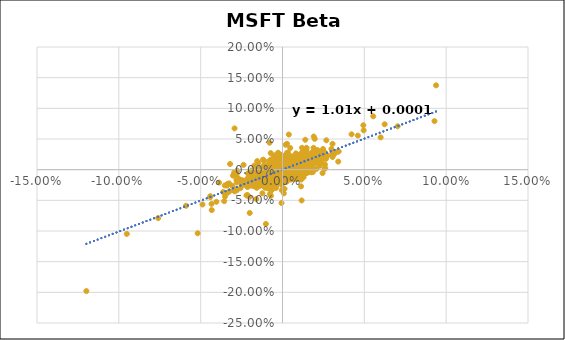
| Category | Series 0 |
|---|---|
| 0.0022232803457622463 | -0.002 |
| -0.016643094431470606 | -0.019 |
| -0.018151208036480848 | -0.026 |
| 0.00304327583661701 | 0.001 |
| -0.006554890129173208 | -0.003 |
| 0.015532409517731827 | 0.006 |
| 0.003261703042884756 | 0.02 |
| 0.02297393528374414 | 0.024 |
| -0.0021831116812874862 | -0.01 |
| 0.008170794068229847 | 0.027 |
| 0.010941355061463431 | 0.008 |
| -0.03236488351007216 | -0.035 |
| -0.0015221883958135285 | 0.004 |
| -0.02332016543333515 | -0.018 |
| 0.001762194844060927 | -0.006 |
| -0.00035636837875119287 | 0.003 |
| 0.005419488922094429 | 0.012 |
| -0.00019991927787654795 | -0.002 |
| -0.019086676677205427 | -0.009 |
| -0.020773476413007863 | -0.025 |
| 8.641209140813899e-05 | 0.012 |
| -0.015395733182517968 | -0.015 |
| -0.015772090500047797 | -0.02 |
| -0.020588306814405377 | -0.022 |
| -0.02711224768478282 | -0.015 |
| 0.049593807154098 | 0.064 |
| 0.008562629168861635 | 0.012 |
| -0.0012415472330372657 | -0.001 |
| 0.008492440882795549 | 0.009 |
| 0.0012685242435728217 | 0.003 |
| -0.02475667621502542 | -0.022 |
| 0.0343356931888279 | 0.03 |
| 0.00701043468644591 | 0.02 |
| 0.009695296290921585 | 0.005 |
| 0.0040980263439003295 | 0.01 |
| 0.004518445159692908 | -0.004 |
| -0.00014634296629478794 | 0.002 |
| -0.005257562801876614 | -0.003 |
| 0.010721711756711327 | -0.013 |
| 0.002221966823736654 | 0.003 |
| 0.007591452926111408 | -0.012 |
| 0.013183052853609212 | 0.027 |
| -0.014157284018107563 | -0.014 |
| 0.0022028941471379238 | -0.001 |
| 0.001375677416909804 | 0.002 |
| 0.0084887201825663 | 0.018 |
| -0.0078468605052614 | -0.003 |
| -0.001456209694195909 | -0.001 |
| 0.015549242424242493 | 0.014 |
| 0.008597377892989533 | 0.007 |
| 0.000898635405495396 | 0.005 |
| 0.006776204217207926 | 0.011 |
| 0.004708481505539597 | 0 |
| -0.002224495014062744 | -0.009 |
| -0.009357119061652264 | -0.004 |
| 0.0006762624489569102 | 0.003 |
| 0.0007090417596054 | -0.009 |
| 0.012890250202966858 | 0.014 |
| 0.003023976857468691 | 0.016 |
| -0.0026516238471793185 | -0.004 |
| 0.010878709851296353 | 0.025 |
| 0.0014987750396311394 | 0 |
| 0.0017771318387196366 | -0.002 |
| -0.003526412180845262 | 0 |
| 0.006411088047050706 | 0.003 |
| 0.0012317960947767492 | -0.013 |
| -0.0007903837831845228 | -0.009 |
| -0.0005440423780378456 | -0.025 |
| -0.0028255466662847617 | 0.008 |
| 0.0068953381050032014 | 0 |
| -0.0038806002090102654 | -0.007 |
| -0.0011314768996100177 | 0.001 |
| -0.0065241159285216455 | 0.002 |
| -0.008125710368218741 | -0.011 |
| -0.0021317385309919112 | -0.007 |
| 0.014666049353461608 | 0.007 |
| 0.0029533287823806376 | 0.009 |
| 0.006949618845646821 | -0.016 |
| -0.0008680432029370966 | 0.003 |
| 0.004984902865607044 | 0.003 |
| 0.0037059607153993035 | 0.007 |
| -0.0001306063665308388 | 0.004 |
| -0.0029443226469249018 | 0.011 |
| 0.010852515552911779 | 0.021 |
| -0.018974527826038257 | -0.006 |
| -0.0008390729493592541 | 0.005 |
| 0.007182778484540853 | -0.002 |
| -0.004644380264399728 | 0 |
| 0.0035895443381801506 | 0.004 |
| 0.006734293751598397 | 0.01 |
| 0.01156858594411525 | 0.02 |
| 1.7438676892522764e-05 | -0.007 |
| 0.0021484075277968806 | 0.022 |
| 0.0020846384074615365 | 0.009 |
| 0.004636398681665099 | 0.008 |
| 0.0010474498226595852 | 0.007 |
| -0.0060674708281390766 | -0.013 |
| 0.0034778681120144483 | -0.007 |
| 3.808587325715429e-05 | 0.01 |
| 0.006609378462220095 | 0.012 |
| -0.0006294261903205811 | 0.005 |
| 0.000509364739569973 | -0.002 |
| -0.002273774879087531 | 0.01 |
| 0.0015790653174507785 | -0.004 |
| 0.001012037741434657 | -0.004 |
| 0.008841219132246891 | 0.006 |
| -0.0021917864252406494 | 0.003 |
| -0.00036894696387390624 | -0.001 |
| 0.004685305365033532 | -0.014 |
| 0.0010714723049920494 | -0.007 |
| 0.0009514004274504551 | 0.008 |
| -0.007502130129708795 | -0.024 |
| -0.0021239991380873624 | 0.011 |
| 0.00963832295922562 | -0.002 |
| -0.004471014787957861 | -0.005 |
| -0.016511677868827124 | -0.024 |
| -0.0016053813214057522 | 0.002 |
| -0.0030214418181440106 | -0.003 |
| 0.0037203210344445292 | 0 |
| -0.024130630943291487 | -0.022 |
| 0.008016017810211773 | 0.007 |
| 0.00583895766667486 | 0.001 |
| 0.008895249319527565 | 0.003 |
| -0.005837319908772343 | 0.001 |
| -0.006749360908960611 | -0.008 |
| 0.008495790833841 | 0.003 |
| -0.002824365652362215 | -0.013 |
| -0.011914139769699683 | 0.016 |
| 0.001353534780883292 | 0.008 |
| -0.008375618352052028 | -0.011 |
| -0.0069119572935958384 | -0.008 |
| 0.0020984398243635294 | 0.006 |
| -0.013195355808466647 | -0.006 |
| -0.0027652013400870645 | -0.001 |
| 0.021432345278653342 | 0.03 |
| 0.008161896642135735 | 0.007 |
| 0.006135555437609463 | 0.002 |
| 0.010497663083042452 | 0.001 |
| 0.0046600819951694294 | 0.004 |
| -0.00034987685027698667 | 0 |
| -0.002037619727485618 | 0.005 |
| 0.004097449858325275 | 0.017 |
| -0.0016115422390061696 | 0.017 |
| 0.0009317695307899942 | 0.006 |
| 0.009717372571954597 | 0.002 |
| 0.002985176934281464 | 0.002 |
| 0.009472195075278522 | 0.016 |
| -0.0012592326804730103 | -0.009 |
| -0.001731933325650914 | -0.019 |
| -0.009496324715228988 | -0.004 |
| -0.0012339839170762978 | 0.008 |
| 0.003823212459416858 | 0.003 |
| 0.005757422425228809 | 0.005 |
| 0.007672277820080398 | 0.011 |
| 0.0029281490252435205 | -0.001 |
| 0.007672358989710748 | 0.009 |
| -0.0018058494836139527 | -0.003 |
| -0.004835457345313876 | 0.007 |
| 0.0012365799156572876 | -0.004 |
| 0.004510627158405667 | -0.006 |
| 0.002285278994477169 | 0.016 |
| 0.004620138604158219 | 0.02 |
| 0.00017585947169163063 | 0.002 |
| -0.0034037753375577573 | -0.007 |
| -0.006531204644412147 | -0.008 |
| 0.0035819355184592006 | -0.005 |
| -0.0061767347442999165 | -0.007 |
| 0.0028287212634507952 | -0.008 |
| 0.006847502370160408 | 0.009 |
| 0.00468811866363672 | 0.008 |
| -0.00526235610486292 | 0.004 |
| 0.007387629133693174 | 0.006 |
| -0.00161606948107329 | 0.005 |
| -0.002578641959370631 | -0.003 |
| -0.010885509660889747 | -0.017 |
| -0.008998852495319398 | -0.004 |
| -0.0072827367651240316 | -0.003 |
| -0.02977780051499812 | -0.034 |
| 0.013017006826634425 | 0.019 |
| 0.0007668897934256513 | -0.004 |
| 0.01876226603513209 | 0.018 |
| -0.006616543400644659 | -0.007 |
| -0.0123173384955374 | -0.014 |
| 0.015131647413882954 | 0.006 |
| -0.02929276360753441 | -0.032 |
| 0.002464268112370549 | 0.001 |
| 0.014426183452732166 | 0.009 |
| 0.012105875347909967 | 0.021 |
| -0.007914764079147596 | 0.044 |
| 0.008246825558263726 | 0.015 |
| -0.0005060815269983809 | 0.003 |
| -0.025946389777450785 | -0.016 |
| 0.010983067039910699 | 0.005 |
| -0.0032031906836484936 | -0.002 |
| 0.006545469754213773 | 0.017 |
| 0.012687244194824032 | 0.024 |
| 0.0006428273461489553 | 0.003 |
| -0.006899120439028739 | -0.017 |
| 0.010842075925499017 | 0 |
| 0.013009823744460025 | 0.018 |
| 0.0009106182795699524 | 0.013 |
| -9.400042300200528e-05 | 0.008 |
| 0.00032231746255573235 | 0.001 |
| 0.0072296678179091245 | -0.001 |
| 0.0028791074766822966 | 0.005 |
| -0.0007243559711188619 | 0.001 |
| -0.0031356092824674775 | -0.013 |
| 0.002581755593803692 | -0.003 |
| 0.0003426822370828919 | 0.003 |
| 1.9955233758972568e-05 | -0.012 |
| -0.004895586322955614 | -0.015 |
| -9.69228661094057e-05 | 0.007 |
| -0.00841639425358831 | -0.004 |
| 0.006158565361019441 | 0.012 |
| -0.0024289165022262083 | 0.007 |
| -0.005316326462073695 | 0 |
| 0.005047623227845355 | 0.009 |
| -0.012258376613342059 | -0.004 |
| -0.01790323952044892 | -0.024 |
| 0.007971990677411389 | 0.006 |
| 0.014216853396000317 | 0.005 |
| -0.004478304612789308 | -0.005 |
| -0.015560826054260457 | 0 |
| 0.009104546742895181 | 0.01 |
| 0.00641570185654583 | 0.012 |
| 0.010938930544257763 | 0.013 |
| -0.001387079289088211 | -0.002 |
| 0.009955666436289423 | 0.006 |
| -0.0019995460129251796 | 0.001 |
| 0.002762828253096483 | 0.004 |
| -0.003919344885671916 | 0.005 |
| 0.006871609403255041 | -0.005 |
| -0.0035686728395061262 | 0.002 |
| 0.002847139009142241 | -0.011 |
| 0.001920439870594981 | -0.003 |
| 0.004072697314876805 | 0.002 |
| 0.00558137996062924 | 0.01 |
| -0.0008323956544341593 | -0.011 |
| 0.0032533282404039188 | 0.009 |
| -0.0030228734036372717 | -0.007 |
| 0.009662360578885698 | 0.012 |
| 0.00370405391746087 | -0.01 |
| -0.001185730946278274 | -0.012 |
| 0.0007025258405917167 | 0.008 |
| 0.0027301269509030224 | -0.005 |
| 0.002560628553277322 | 0 |
| -0.001962445200253349 | -0.004 |
| 0.001564620781921544 | 0.006 |
| 0.0007115504036430131 | 0.007 |
| 0.0008370932502488326 | 0.007 |
| 0.007695462486638771 | 0.003 |
| 0.0005031309486422941 | 0.007 |
| -0.000592563172038818 | -0.054 |
| -0.0037561935529359936 | -0.022 |
| -0.0015827773238195064 | -0.011 |
| 0.0021749357185665286 | -0.002 |
| 0.007507338543994324 | 0.002 |
| 0.0021955297992111156 | 0.011 |
| 0.00417446792250975 | 0.01 |
| -0.004011250527170329 | -0.011 |
| -0.008631064190157245 | -0.013 |
| -0.006638042050567283 | -0.017 |
| 0.006323548428811776 | 0 |
| 0.001500276282141666 | -0.005 |
| 0.009135730393304842 | 0.006 |
| -0.00316283682622831 | 0.011 |
| -0.0010969527672547441 | -0.003 |
| 0.0029082017034209873 | -0.018 |
| 0.008575166394515055 | 0 |
| 7.258794976916505e-05 | 0.01 |
| 0.007147816208028068 | 0.007 |
| 0.00033527080167328194 | 0.01 |
| -0.000432260408705365 | 0.001 |
| 0.004459221469443442 | 0.01 |
| 0.0049448269622538454 | 0.004 |
| 0.0008661314657181229 | -0.009 |
| -0.0001954088231737039 | 0.007 |
| 0.005128157399996169 | 0.001 |
| 3.395156038288327e-05 | -0.004 |
| -0.005780828513404224 | -0.012 |
| 0.002946024729223451 | 0.005 |
| 0.008378781594537532 | 0.006 |
| -0.007059870773669763 | -0.003 |
| 0.0035333941295578875 | 0.005 |
| -0.0028032085956850583 | -0.007 |
| 0.0049024150649641385 | 0.015 |
| 0.006655292725288531 | 0.015 |
| -0.0028552233792408233 | -0.004 |
| 0.006976281256220629 | -0.004 |
| -0.0015145386587512855 | -0.002 |
| 0.001870155186330269 | 0.008 |
| 0.00836654718799501 | 0.019 |
| 0.003862144651035182 | 0.014 |
| -0.002651954277064661 | 0.004 |
| 0.0002890878375325645 | 0 |
| 0.0011409648528637462 | 0.003 |
| -0.009042140524546438 | -0.007 |
| -0.015730684849202037 | -0.003 |
| 0.010053551114029613 | 0.012 |
| -0.0008668473616095795 | 0.001 |
| 0.003134355715769477 | -0.005 |
| -0.017705852615678808 | -0.02 |
| 0.0072546442124061805 | 0.015 |
| 0.014980362705145023 | 0.015 |
| 0.011250640619361318 | 0.013 |
| 0.0033256464618900416 | 0.003 |
| -0.005400833288500828 | -0.006 |
| 0.007326359568592178 | 0.014 |
| 0.0016884988171557147 | 0.004 |
| 0.0064626610081155444 | 0 |
| -0.0016304428235363044 | 0.003 |
| 0.0018435419717006685 | 0.011 |
| -0.0029199801192842934 | -0.004 |
| 0.004705826501577137 | -0.001 |
| -0.0038155427255142094 | 0.014 |
| -0.010518108756295885 | -0.007 |
| -0.0335135944873044 | -0.023 |
| -0.030280015747592093 | -0.01 |
| -0.003778518705585654 | -0.009 |
| -0.044163278665378725 | -0.045 |
| -0.008238327357692588 | -0.031 |
| 0.04603922524388837 | 0.056 |
| -0.028107940185681968 | -0.009 |
| 0.042202592421180185 | 0.058 |
| -0.03392202215889484 | -0.026 |
| -0.017053909799797706 | -0.027 |
| -0.07596968075979771 | -0.079 |
| 0.04939633578003022 | 0.072 |
| -0.048868410917935035 | -0.057 |
| -0.09511268047479748 | -0.105 |
| 0.0928711945304439 | 0.079 |
| -0.11984050283657066 | -0.198 |
| 0.05995482224354909 | 0.053 |
| -0.05183082330706679 | -0.104 |
| 0.004707893749218206 | 0.035 |
| -0.043359522534749395 | -0.056 |
| -0.02929385835517062 | 0.067 |
| 0.09382765710199337 | 0.138 |
| 0.011535019797084933 | -0.016 |
| 0.06241416083633622 | 0.074 |
| -0.0336873163071707 | -0.024 |
| 0.03351603599491648 | 0.029 |
| -0.0160127919593398 | -0.048 |
| -0.04414239782712159 | -0.043 |
| 0.022829386763812964 | 0.015 |
| -0.015137124539950086 | -0.014 |
| 0.07033130412070787 | 0.071 |
| -0.0016030454108602044 | 0.005 |
| 0.03405642604938697 | 0.013 |
| 0.01448737809002254 | 0.034 |
| -0.010104594561656355 | -0.014 |
| 0.030572524197665762 | 0.042 |
| -0.022030456139364496 | -0.042 |
| 0.005816710738100639 | 0.007 |
| 0.026793591827257934 | 0.048 |
| -0.017880997439608137 | -0.016 |
| -0.030674846625766805 | -0.026 |
| 0.02293024819481393 | 0.018 |
| -0.000539418642451106 | -0.009 |
| 0.01391807849024218 | 0.049 |
| 0.014714073196697708 | 0.026 |
| -0.005242350129234907 | -0.001 |
| 0.026583874358714787 | 0.019 |
| -0.009212419757034462 | -0.009 |
| -0.028059043479156554 | -0.006 |
| 0.004249817183674676 | 0.015 |
| 0.009040573531170715 | 0.017 |
| -0.006979403438802989 | -0.007 |
| 0.011504623615899323 | 0.025 |
| 0.016871501011734846 | 0.022 |
| 0.0001331148883882971 | 0.009 |
| -0.020500377108651713 | -0.015 |
| -0.017462684487059787 | -0.012 |
| 0.01152482269503552 | 0.019 |
| 0.003926380368098004 | 0.021 |
| 0.03150120473513285 | 0.025 |
| -0.010484408800538914 | -0.03 |
| 0.01665104312780974 | 0 |
| -0.007773563825670182 | 0.011 |
| 0.002353731206609311 | 0.004 |
| 0.012289160703107926 | 0.002 |
| 0.014827343010993532 | 0.02 |
| -0.0021079466294262605 | -0.009 |
| 0.004812310007822562 | 0.014 |
| 0.0037512605483673855 | -0.005 |
| 0.00821080396500995 | 0.022 |
| 0.013648963587616247 | -0.007 |
| -0.0033686961032639573 | -0.008 |
| 0.02621170498176606 | 0.024 |
| 0.012041591393674889 | 0.007 |
| -0.007799182648133396 | 0 |
| -0.0053130787794885 | -0.009 |
| -0.058944121574601716 | -0.059 |
| 0.013060857399820103 | 0.012 |
| 0.008312207568449193 | -0.004 |
| 0.018962430582503575 | 0.036 |
| -0.0036002995449221364 | 0.004 |
| 0.000594188515139038 | -0.007 |
| -0.005649463621948292 | -0.01 |
| 0.006495057687217143 | 0.01 |
| 0.004307441642665166 | 0.005 |
| -0.025855158736495243 | -0.017 |
| 0.01095946995898811 | -0.003 |
| -0.024226917788673585 | -0.018 |
| 0.01468569814393228 | 0.021 |
| 0.015409859690034278 | 0.018 |
| 0.005022110834792981 | -0.009 |
| 0.004541282342595654 | 0.001 |
| 0.0158817383970018 | 0.004 |
| -0.010818562640735552 | -0.009 |
| 0.007827502448081614 | 0.007 |
| -0.005643639942711776 | -0.005 |
| 0.01046620453355751 | 0.009 |
| -0.009362519779971379 | -0.002 |
| 0.013406355182839835 | 0.033 |
| 0.00908203857989931 | 0 |
| -0.0034061043340275488 | 0.001 |
| 0.00284863958800452 | 0.009 |
| 0.008406905384326757 | -0.001 |
| 0.0016790493997245193 | 0.009 |
| 0.005747091149111094 | 0.01 |
| -0.012319827107282633 | -0.005 |
| -0.0061903908321639944 | 0.006 |
| 0.007395129414764723 | 0.008 |
| -0.006473401020556158 | -0.008 |
| 0.012428381451883519 | -0.002 |
| -0.0037502608610255894 | 0.006 |
| 0.007670459796317086 | -0.003 |
| 0.007181026681992719 | 0.003 |
| 0.0036119601409574376 | 0.006 |
| 0.0064297401187354275 | -0.001 |
| 0.006427727877827971 | 0.007 |
| 0.0006329945419150107 | 0.008 |
| 0.0027422358024395965 | 0.011 |
| -0.007969123366671882 | 0.001 |
| 0.013996502374245878 | 0.024 |
| -0.0020471252976762555 | 0 |
| -0.00017193183199293305 | -0.004 |
| 0.0027098744385312123 | 0.027 |
| 0.0023033775972136628 | -0.011 |
| -0.004404415625792857 | -0.008 |
| 0.0031586589033587575 | -0.008 |
| 0.0034411358997610275 | 0.009 |
| 0.01004368354743379 | 0.012 |
| 0.003596325569466652 | -0.002 |
| 0.010195666188487662 | 0.02 |
| 0.0016730243508407128 | -0.011 |
| 0.006732576659826961 | -0.008 |
| -0.0021949766391772263 | -0.004 |
| 0.00752504778148233 | 0.003 |
| 0.015365857116526938 | 0.004 |
| -0.03512583639592948 | -0.044 |
| -0.008132999137496877 | -0.018 |
| -0.027756378831384043 | -0.001 |
| 0.020145024971186976 | 0.029 |
| -0.017584790641843373 | -0.016 |
| 0.0005330634075928486 | 0.013 |
| 0.01274180851668838 | 0.016 |
| 0.005219385613883576 | 0.018 |
| -0.004618958014818264 | -0.014 |
| -0.00841237162124231 | -0.006 |
| -0.01118257020384228 | -0.017 |
| -0.011571124305988612 | -0.01 |
| 0.010517942372282096 | 0.004 |
| -0.02372141140135786 | -0.025 |
| 0.002987407782707008 | -0.003 |
| 0.015976763311659203 | 0.011 |
| 0.016110548559024496 | 0.014 |
| -0.004812626805108078 | -0.001 |
| 0.008253709372292528 | 0.021 |
| 0.005292893250074426 | 0 |
| -0.009577614765735931 | 0.006 |
| 0.017972655760030154 | 0.01 |
| -0.01397347884762079 | -0.02 |
| 0.017396763434365692 | 0.023 |
| 0.008010083522448141 | 0.006 |
| 0.008793587151092463 | 0.005 |
| 0.016415789988323715 | 0.003 |
| -0.006306907889152336 | 0.012 |
| -0.006623138843883547 | -0.011 |
| -0.0015278028589691406 | 0.002 |
| 0.00013492797142955482 | 0 |
| -0.016329822808936134 | -0.014 |
| 0.0047272769717412455 | 0.008 |
| -0.002195682985199454 | -0.005 |
| 0.005218945382994278 | -0.012 |
| 0.0034457896215134287 | 0.007 |
| -0.01858953826264864 | -0.025 |
| -0.0030256074002417144 | 0.003 |
| -0.03528790685054317 | -0.026 |
| 0.011947307117329942 | 0 |
| -0.012129506270184387 | -0.011 |
| 0.01231819349472163 | 0.015 |
| 0.017799313644932147 | 0.024 |
| 0.022047038430944355 | 0.019 |
| 0.019460190971818836 | 0.011 |
| -0.00028771240154390476 | -0.006 |
| 0.011699872344305584 | -0.05 |
| -0.001399802844669673 | 0.021 |
| 0.007651888434169196 | 0.008 |
| -0.009978559392721298 | -0.005 |
| 0.013610365817456005 | 0.003 |
| 0.011648048198820149 | 0.009 |
| -0.004791957892531062 | -0.025 |
| -0.01156383241031389 | -0.01 |
| 0.003946420613320845 | 0.004 |
| -0.0067925413261787915 | -0.004 |
| 0.00563591695385024 | 0.006 |
| 0.016161717804443754 | 0.007 |
| -0.0015844155129681736 | 0.002 |
| 0.0023969253233782073 | 0.007 |
| -0.0045954897137437944 | 0.005 |
| 0.011271167954760575 | -0.003 |
| 0.0017911507324332998 | -0.02 |
| -0.0006241465681479097 | -0.011 |
| 0.008836235109307422 | -0.015 |
| -0.0019355954929820562 | -0.005 |
| 0.002787137455443789 | -0.004 |
| -0.007949220068876994 | 0.015 |
| -0.0012851160688518437 | -0.003 |
| -0.001264960061067022 | -0.001 |
| -0.004359266922526861 | 0.004 |
| 0.012921214314501217 | 0.009 |
| 0.0017728480872187813 | 0.006 |
| 0.005757638800703457 | 0.016 |
| -0.0035111001267972286 | -0.013 |
| -0.003906281591951277 | 0.002 |
| -0.0020731166033364223 | -0.004 |
| 0.0007458112528002658 | -0.001 |
| 0.0035365757816374632 | 0.004 |
| 0.008722515973276224 | -0.006 |
| -0.0022273622890431888 | -0.011 |
| 0.0013415471795312772 | -0.003 |
| 0.00643883774021714 | 0.001 |
| -0.01475478359029514 | -0.006 |
| 0.007082539553862066 | 0.008 |
| 0.005709900559720538 | 0.006 |
| 0.01484736429268918 | -0.005 |
| 0.005491890982414871 | 0.011 |
| -0.006554796741165214 | 0.008 |
| 0.0004158321511944507 | 0.019 |
| 0.0022756031663768717 | -0.008 |
| -0.003753438464607517 | -0.021 |
| -0.00719001775768402 | 0.027 |
| 0.008136402839514334 | -0.009 |
| 0.013935576257400273 | 0.004 |
| 0.0003167309215053038 | 0.017 |
| -0.0030105863636010755 | 0.018 |
| 0.003615803325289546 | 0.004 |
| -0.0014888363213811928 | -0.009 |
| -0.025677859113367063 | -0.03 |
| 0.009760662477304782 | 0.015 |
| -0.019311502938707092 | -0.026 |
| 0.01605173602136656 | -0.003 |
| 0.013898236818535858 | 0.008 |
| 0.001008804827627774 | 0.007 |
| 0.01085330416143404 | 0.017 |
| 0.003897472454245321 | 0 |
| 0.007399345996609075 | 0.004 |
| -0.0011134975827398197 | -0.012 |
| -0.0003451599624669788 | 0.007 |
| 0.0016624551137118804 | -0.006 |
| 0.004710983101741784 | 0.002 |
| -0.0005692749114954987 | -0.008 |
| -0.0003203995331321208 | 0.02 |
| -0.004415808390544673 | 0.008 |
| -0.0018548941356217874 | -0.012 |
| -0.007732849379657014 | -0.014 |
| 0.0012562878885591378 | -0.031 |
| 0.01135166191319037 | -0.027 |
| -0.024478846903396523 | -0.018 |
| -0.004750165824920272 | 0.012 |
| 0.023790719336683086 | 0.013 |
| -0.008080844323930969 | -0.005 |
| -0.01306620434127681 | -0.011 |
| -0.013417213827191521 | -0.025 |
| 0.019495975820425837 | 0.01 |
| -0.005359271617984662 | 0.022 |
| 0.014154683554241432 | 0.023 |
| 0.006030283013025661 | 0.005 |
| 0.010395479646353678 | 0.01 |
| 0.0010153985185334946 | 0.016 |
| 0.006491958593476621 | 0.02 |
| -0.0015696886322292825 | 0.013 |
| 0.0028793426720601367 | -0.007 |
| -0.014760500437832724 | 0.011 |
| -0.0006027388863633076 | 0.021 |
| 0.0070251207482558975 | -0.001 |
| -0.0076308370066411335 | 0.004 |
| -0.005467303581109473 | 0.01 |
| 0.00524023305923671 | 0.015 |
| 0.016631197691788335 | 0.022 |
| -0.0008680249789911887 | -0.005 |
| -0.003157823166939022 | 0.009 |
| 0.003622538555784205 | 0.001 |
| 0.011825144919693331 | 0.008 |
| 0.014438277854756487 | 0.025 |
| -0.0009735379152555623 | -0.005 |
| 0.0014752303666720756 | -0.004 |
| 0.004220639958823158 | 0.006 |
| 0.007719962803593772 | 0.015 |
| -0.000196182910288778 | 0.005 |
| 0.00329458162447116 | -0.001 |
| -0.0040878020277237415 | -0.001 |
| 0.011094247768300924 | 0.008 |
| 0.0036087492386858155 | 0.017 |
| -0.005306453038726788 | -0.004 |
| -0.006802361610853236 | -0.009 |
| 0.009306060063749566 | 0.006 |
| -0.009210671343885979 | -0.014 |
| 0.010928710658818286 | 0.008 |
| 0.001782224167916624 | -0.012 |
| -0.0002149192142553158 | 0.002 |
| -0.0008455306301830001 | -0.003 |
| 0.006762797680233579 | 0.018 |
| -0.007194637501869883 | -0.005 |
| 0.0027480346410215795 | 0.02 |
| -0.006678337857112138 | 0.008 |
| 0.0007035388242977447 | -0.002 |
| 0.008165390549454088 | 0.017 |
| 0.007373346471123199 | 0.005 |
| -0.010435666020885526 | 0.006 |
| -0.008673894514173552 | -0.031 |
| -0.021449387057151936 | -0.041 |
| 0.012173151138064053 | 0.027 |
| 0.014917933130699224 | -0.006 |
| -0.0025300382141189015 | -0.011 |
| -0.008517302421882755 | -0.01 |
| -0.0029434351705374118 | -0.007 |
| 0.010554756443649449 | 0.005 |
| -0.0007838196541576359 | 0 |
| 0.009911305963146155 | -0.003 |
| -0.002125302295660103 | 0.006 |
| 0.001876732575158746 | 0.002 |
| 0.0011653983922745859 | 0.005 |
| 0.0007688865190149663 | 0 |
| -0.0004923753184382651 | -0.008 |
| 0.0014469162597214869 | -0.01 |
| -0.003628698801364849 | -0.006 |
| 0.00883408659980689 | -0.001 |
| -0.0007967110255822085 | -0.003 |
| 0.00017508493985585183 | 0.003 |
| -0.0018238764589828538 | -0.011 |
| 0.004652154850635748 | 0.003 |
| 0.0019484900381676606 | 0.008 |
| 0.0018152110447704484 | -0.005 |
| -0.0020116799642784233 | -0.009 |
| -0.005390207201542929 | -0.012 |
| -0.0004356370007340127 | 0.001 |
| -0.013124547000611053 | -0.002 |
| 0.01400232812106239 | 0.016 |
| 0.005124515064653945 | 0.017 |
| -0.0010832603310065858 | -0.003 |
| 0.005811157422250579 | 0.001 |
| 0.003330606657931945 | 0.006 |
| 0.0023150419323942906 | 0.002 |
| 0.00027734984069871516 | 0.013 |
| 0.001328114078009257 | 0.002 |
| 0.005221640488656032 | 0.008 |
| 0.0075001041681135305 | 0.004 |
| -0.002021900862524517 | -0.011 |
| 0.003359011313352811 | 0.013 |
| -0.00856101125941644 | -0.015 |
| 0.01127795187024705 | 0.011 |
| 0.0034511562975592103 | -0.001 |
| -0.003516830382495284 | -0.015 |
| 0.0011649703264435818 | 0.007 |
| -0.0032622362435132946 | 0.011 |
| -0.007538938952254881 | -0.004 |
| -0.015869531055010655 | -0.008 |
| 0.01516265155019747 | 0.02 |
| 0.008241847210077813 | 0.003 |
| 0.0020166609692362503 | 0.001 |
| 0.010145438559535647 | 0.019 |
| 0.002382253008416102 | -0.005 |
| -0.004712479931257563 | -0.012 |
| -0.00018630181803303003 | -0.005 |
| 0.004206206369982368 | 0.006 |
| -0.005406016994218166 | 0.002 |
| -0.0018428943907755624 | -0.003 |
| 0.008203484714484954 | 0.014 |
| -0.00463244520307915 | -0.005 |
| 0.006005460335342772 | 0.008 |
| 0.0016752839177258672 | -0.01 |
| -0.000939925887858073 | -0.003 |
| 0.000992701388653705 | 0.008 |
| 0.0012757085704626636 | 0.017 |
| 0.004146398013690877 | -0.009 |
| 0.0016073241975147479 | -0.008 |
| 0.0026208594449417255 | 0.011 |
| -0.0070607249129965854 | -0.043 |
| -0.010748457761550978 | 0.002 |
| 0.0012567410636163956 | 0.004 |
| 0.008141540696354754 | 0.02 |
| 0.008523820995256282 | -0.005 |
| 0.0014956926284677152 | -0.009 |
| 0.0022201269217136943 | -0.003 |
| -0.005824931775569864 | -0.007 |
| 0.008807606263982137 | 0.006 |
| 0.00430658828173347 | 0.012 |
| -0.001349146239944865 | -0.003 |
| 0.0003117620525883158 | -0.008 |
| 0.0028425606033477546 | 0.013 |
| -0.000335026835208585 | 0.008 |
| -0.003395488410139813 | -0.004 |
| -0.0013185753191903293 | 0.008 |
| -0.004605599824548556 | 0.001 |
| -0.0077226435922087555 | 0.001 |
| 0.0022765095613401787 | 0.011 |
| -0.00574659914561837 | -0.007 |
| 0.008473908688851006 | 0.001 |
| -0.0015510969268194286 | 0.009 |
| -0.009110924839340617 | -0.002 |
| -0.016977254629493954 | -0.013 |
| -0.0008123495489623656 | 0.009 |
| 0.009519566210937302 | 0.005 |
| 0.012134751708511082 | 0 |
| 0.0014610090402744635 | 0.005 |
| -0.0027763563072890074 | 0.012 |
| -0.020364114325326033 | -0.022 |
| 0.001569166228234442 | 0.009 |
| -0.011909731939276913 | -0.026 |
| 0.011491477734391298 | 0.005 |
| -0.012985880322420762 | -0.01 |
| 0.010524455523362564 | 0.009 |
| 0.004102887438675262 | 0.003 |
| 0.00829828923697451 | 0.022 |
| -0.0019137407494954628 | -0.009 |
| -0.0068657858421348195 | 0.008 |
| -0.0024167715692277048 | 0.002 |
| 0.003022536862308023 | 0.001 |
| 0.01706311013337003 | 0.017 |
| 0.0074601307719690535 | 0.018 |
| 0.0033748045900920953 | 0.013 |
| 0.00739335690054066 | 0.008 |
| 0.0036640167447334893 | 0.001 |
| 0.002995906256131331 | 0.018 |
| -0.0010725793335062406 | 0.004 |
| 0.004748179277871856 | 0.014 |
| 0.0018197824144636776 | -0.006 |
| -0.005051597996847845 | 0.008 |
| 0.009829337739032606 | -0.002 |
| 0.0019493431844783693 | 0 |
| 0.0018000686154020507 | -0.014 |
| 0.0036803672564356127 | 0.002 |
| 0.00646129593037692 | 0.005 |
| 0.004181891914508462 | 0.009 |
| 0.0037328581257503046 | -0.01 |
| 0.0008877005575269603 | 0.001 |
| -0.0034987345002870374 | 0.006 |
| -0.008225815057894437 | -0.006 |
| 0.0005509274303756584 | -0.003 |
| 0.007222639253044116 | 0.014 |
| -1.0677258507119092e-05 | -0.004 |
| 0.003865208849406221 | 0.057 |
| -0.0026016294752068125 | 0.006 |
| 0.00338475516511072 | 0.028 |
| -0.0013986489646171663 | 0.007 |
| -0.0031971323723489764 | 0 |
| 0.0016570786727996278 | -0.001 |
| 0.002293900697124096 | 0.009 |
| -0.02272485568312821 | -0.023 |
| 0.013200221128189193 | 0.01 |
| -0.01896130621854386 | -0.015 |
| -0.011815195971097037 | 0 |
| 0.014194423271231882 | 0.018 |
| -0.00844858097922263 | 0 |
| 0.011730928977641941 | 0.019 |
| 0.020707063007576743 | 0.001 |
| 0.0030852936469836223 | -0.012 |
| -0.007181129964413446 | 0 |
| 0.00954911139915815 | 0.01 |
| -0.009136209099282255 | -0.024 |
| -0.007470598440341258 | -0.008 |
| 0.016348409288555077 | 0.014 |
| -0.00874337823922211 | -0.02 |
| -0.010287726483131143 | -0.029 |
| -0.011388032826621375 | 0.004 |
| 0.017777943178882483 | 0.003 |
| 0.010180180373954517 | 0.013 |
| 0.006223704157936716 | 0.004 |
| 0.01383895602639984 | 0.018 |
| -0.0010101874482121298 | 0.005 |
| 0.0014019033292591576 | 0.011 |
| -0.002989739331450192 | -0.002 |
| -0.0026262207741385435 | 0.012 |
| 0.00637407735335227 | -0.015 |
| -0.000629617892823231 | 0.01 |
| -0.01939276609770646 | -0.014 |
| -0.0009637108612128298 | -0.004 |
| -0.0040502124125595396 | -0.03 |
| -0.0014410854751839564 | -0.016 |
| 0.009160030747555226 | -0.002 |
| 0.002817696321081753 | 0.007 |
| -0.014243549462058636 | -0.006 |
| 0.0008199131578892072 | -0.039 |
| -0.0183878958147915 | -0.014 |
| -0.009689520243122751 | -0.019 |
| -0.01103742532143781 | -0.028 |
| -0.01891481307149878 | -0.001 |
| 0.0027717522294530283 | 0.042 |
| -0.012171976789799865 | -0.013 |
| -0.0014966314315554285 | -0.005 |
| -0.005383994684971971 | -0.002 |
| 0.024347568825681787 | 0.028 |
| 0.018886018254227865 | 0.001 |
| 0.006862951356977565 | 0.005 |
| 0.009422549895085064 | 0.014 |
| -0.024391094221877574 | -0.024 |
| 0.005156964694110977 | -0.014 |
| -0.003701786234065696 | -0.006 |
| 0.008401224834796661 | 0.011 |
| 0.014517177775713597 | 0.008 |
| -0.018115705073705524 | -0.025 |
| -0.0189694676826343 | -0.014 |
| -0.0038405482229827426 | 0.004 |
| 0.015766743077059386 | 0.005 |
| 0.0008812208263346832 | -0.009 |
| -0.021173137043269175 | -0.006 |
| -0.007166241273349194 | -0.003 |
| -0.010142864698185927 | -0.089 |
| -0.018412176288573612 | -0.024 |
| 0.014956809844988816 | 0.016 |
| 0.022372746986266234 | 0.011 |
| -0.002442612295166069 | -0.003 |
| -0.015473463284818578 | 0.014 |
| 0.018642627244987553 | 0.022 |
| -0.005254711002293466 | -0.009 |
| -0.00793401612012401 | 0 |
| -0.02951809594651711 | -0.005 |
| -0.007233836932796112 | -0.019 |
| 0.025698324022346508 | 0.001 |
| -0.0042918454935622075 | 0.002 |
| -0.012961554353542182 | -0.004 |
| -0.00742095611408311 | 0.005 |
| 0.021408493905025416 | 0.032 |
| 0.022383840279651235 | 0.007 |
| 0.012347803738532281 | 0.016 |
| 0.011662250349640857 | 0.013 |
| -0.00043467350194470455 | -0.033 |
| 0.011304184094790948 | 0.001 |
| -0.012272780670315009 | -0.038 |
| 0.014343931206577842 | -0.004 |
| 0.005066192347173759 | -0.016 |
| 0.007144963967017803 | 0.012 |
| 0.012256530405287291 | 0.011 |
| -0.006293721392175655 | -0.029 |
| -0.015652532890091164 | -0.03 |
| 0.0034102873691344016 | 0.009 |
| 0.0080908782936564 | 0.012 |
| -0.012551716914267819 | -0.002 |
| -0.009716869386889204 | -0.021 |
| 0.004253372460194527 | 0.014 |
| -0.0026509873983658894 | 0.028 |
| -0.01687728929567678 | -0.014 |
| -0.003417540503973915 | -0.001 |
| 0.011174658040455254 | 0.013 |
| -0.012144137417661627 | -0.019 |
| -0.000204890508788802 | -0.014 |
| 0.016057599693967584 | 0.025 |
| -0.0006185275905885579 | 0.024 |
| -0.01475294038502506 | -0.015 |
| -0.02773997077607282 | -0.033 |
| 0.005697858972138148 | 0.016 |
| -0.02814632738377887 | -0.016 |
| 0.002098103084882119 | 0.005 |
| 0.02474689050564538 | 0.034 |
| -0.03628454810495618 | -0.036 |
| 0.005675313957399952 | 0.022 |
| 0.004837102743912469 | -0.007 |
| 0.0298624349775356 | 0.034 |
| -0.03564975338184306 | -0.051 |
| -0.005674159064547379 | -0.016 |
| -0.032037134944001844 | 0.009 |
| 0.00245788276325154 | -0.02 |
| -0.016463178415666024 | -0.028 |
| -0.0012960017076728558 | 0.024 |
| 0.02386974310955492 | 0.022 |
| -0.003946429947140562 | 0 |
| 0.020169610355263545 | 0.017 |
| -0.04039522115020122 | -0.052 |
| -0.005833809077192775 | 0.009 |
| 0.00014612424662696633 | -0.002 |
| 0.01855506797629536 | -0.004 |
| -0.008120792702107527 | 0.007 |
| 0.009450764687376267 | 0.02 |
| 0.01988322907058282 | 0.031 |
| 0.024742227391912897 | 0.019 |
| -0.006274289122320975 | -0.019 |
| -0.007482787410912017 | -0.018 |
| 0.018431056049039052 | 0.029 |
| -0.016347364741597592 | -0.003 |
| 0.0031373675320187644 | -0.004 |
| 0.009523393579413009 | -0.007 |
| -0.010793908688002896 | -0.014 |
| -0.023798705952956634 | 0.008 |
| -0.02911031355312088 | -0.035 |
| -0.03876837415339185 | -0.021 |
| -0.0037737056722930706 | -0.016 |
| 0.014592502168395916 | 0.004 |
| -0.032511959134456814 | -0.022 |
| 0.0022008470670371594 | -0.01 |
| 0.02447725615264873 | -0.006 |
| -0.0013015334188627437 | -0.001 |
| 0.009532193760987795 | 0.024 |
| 0.03056329085577736 | 0.028 |
| -0.002973101484249896 | -0.001 |
| -0.02014302160708281 | -0.044 |
| -0.000711753084481459 | 0.014 |
| -0.008759227302603145 | 0.001 |
| 0.010553762105785847 | 0.018 |
| 0.0015841770513915776 | 0.017 |
| 0.0035731157621645693 | -0.001 |
| 0.014964578110208349 | 0.011 |
| -0.0008302114989416909 | -0.001 |
| -0.011527473598367033 | 0 |
| -0.009243908956706903 | -0.004 |
| -0.004456897454697795 | 0.007 |
| -0.00299859539478875 | 0.008 |
| 0.019201241036518768 | 0.01 |
| -0.008363619420370894 | 0.002 |
| 0.027628333137554417 | 0.023 |
| 0.005895816028186118 | 0.008 |
| 0.009861360135356989 | 0.009 |
| -0.009332449768064022 | 0.005 |
| 0.0013151152429682345 | -0.001 |
| -0.011543193070554847 | -0.026 |
| 0.026156259165274642 | 0.002 |
| 0.012133382708562568 | 0.002 |
| 0.014207733466259809 | 0.004 |
| -0.0028230463236237346 | 0.016 |
| -0.006662409587654183 | -0.017 |
| 0.015638481713144525 | 0.019 |
| -0.0007773448499099889 | 0.003 |
| -0.0016257460367924415 | 0.008 |
| -0.0012375789770792123 | 0.007 |
| -0.004248730694724312 | -0.022 |
| 0.021290634013103604 | 0.021 |
| -0.0007054229687617486 | -0.003 |
| 0.01732239670855429 | 0.014 |
| 0.00396948705068767 | -0.001 |
| 0.0018756661407353103 | 0.041 |
| -0.0072377589891293725 | -0.005 |
| 0.0022695154935377104 | -0.002 |
| -0.012899942573545653 | -0.012 |
| -0.021400124867564707 | -0.028 |
| -0.0022378014446627903 | -0.017 |
| 0.0029161509713642175 | 0.004 |
| 0.014091582000449021 | 0.005 |
| -0.033688010821315006 | -0.038 |
| -0.0066664037893761074 | -0.006 |
| -0.011028107408059928 | -0.011 |
| -0.007817046982559583 | -0.016 |
| 0.002996207332490508 | 0.017 |
| -0.010736478566116592 | -0.005 |
| -0.004095039574340209 | -0.008 |
| 0.018340971140093032 | 0.027 |
| 0.006610768693449787 | 0.008 |
| 0.015271405678227268 | 0 |
| 0.01058426104401855 | -0.007 |
| -0.043236562775976095 | -0.066 |
| 0.0033869946525153516 | -0.006 |
| -0.011317761485652666 | -0.017 |
| -0.007182129262947479 | 0.016 |
| 0.006857148758303566 | 0.016 |
| -0.011272112803181633 | -0.022 |
| -0.017116493297336777 | -0.009 |
| -0.008427596288058115 | -0.009 |
| -0.01723261637204987 | 0.007 |
| -0.010340542018774879 | -0.016 |
| -0.0021203598319033956 | 0.008 |
| 0.019672140136923533 | 0.05 |
| -0.021126419721218426 | -0.014 |
| -0.01506673588849794 | -0.009 |
| 0.025883947546031072 | 0.028 |
| 0.030583700111188827 | 0.021 |
| -0.0020179744811957834 | 0.001 |
| -0.010245078344716774 | 0.002 |
| -0.028003589245083504 | -0.021 |
| -0.007492458086744369 | -0.007 |
| -0.006519229651283376 | 0.002 |
| -0.0032907569019515748 | -0.008 |
| 0.025965675434648228 | 0.008 |
| -0.023662705624933444 | -0.023 |
| 0.026480085513260976 | 0.017 |
| 0.011427561549232745 | 0.014 |
| -0.006672078882144605 | -0.034 |
| -0.007950941231232078 | -0.022 |
| 0.023724828003862664 | 0.023 |
| 0.011881953234294862 | 0.028 |
| 0.01626664981276371 | 0.025 |
| -0.007387713747470381 | 0 |
| -0.006082598026418751 | 0.003 |
| 0.024626375646783716 | 0.026 |
| -0.007454384193014141 | -0.008 |
| -0.00410126085362017 | 0 |
| -0.025001944970306722 | -0.025 |
| -0.010585979163175718 | -0.025 |
| 0.013618682272863003 | 0.009 |
| 0.00961398204505981 | 0.022 |
| 0.005597877482399927 | 0.003 |
| -0.020777877333723382 | -0.015 |
| 0.05543447234545429 | 0.087 |
| 0.009240793960120008 | 0.01 |
| -0.008935794015923149 | -0.025 |
| 0.008713121485880437 | 0.016 |
| -0.008252061136399536 | 0.01 |
| -0.003089327799655983 | -0.011 |
| 0.004758574556069206 | 0.006 |
| -0.0038836518432215916 | 0.011 |
| 0.013579953113211918 | 0.026 |
| 0.0059147063378277576 | -0.01 |
| -0.0002830708720074071 | 0.015 |
| -0.01544414970244301 | -0.023 |
| -0.0015918505325509535 | -0.009 |
| 0.030947814727501077 | 0.025 |
| -0.0008676236670089876 | 0.01 |
| -0.0011946317615054713 | 0.003 |
| -0.017894245646781326 | -0.024 |
| -0.014399175760970717 | -0.008 |
| -0.001862348589029894 | 0.009 |
| 0.007521759466384781 | 0.012 |
| -0.007349546235533633 | -0.011 |
| 0.014279251114533986 | 0.023 |
| 0.007289703700733785 | 0.015 |
| -0.006052765788066128 | 0.002 |
| -0.024921658340258168 | -0.017 |
| -0.011137778348199956 | -0.013 |
| -0.009007465553582783 | -0.019 |
| 0.0010372846193742458 | -0.008 |
| 0.014868040255179737 | 0.014 |
| -0.014451686760656446 | -0.01 |
| 0.005868056373107056 | 0.008 |
| -0.004049604402806883 | 0.003 |
| -0.01202063067180259 | -0.012 |
| 0.017461316021801565 | 0.015 |
| -0.0025407348906808513 | -0.014 |
| -0.004000520901158988 | 0 |
| 0.00753894993384141 | 0.012 |
| -0.01164556173549236 | -0.013 |
| 0.02284078674404566 | 0.007 |
| -0.0007676350678290644 | 0.001 |
| 0.006978255898501873 | 0.009 |
| 0.012849397206098123 | 0.026 |
| 0.00341595270064321 | 0.003 |
| 0.003996816605869258 | 0.004 |
| -0.0020304619300891558 | -0.011 |
| -0.01556263264319191 | -0.012 |
| -0.007638348019527341 | -0.04 |
| 0.01891839901509429 | 0.013 |
| 0.011881357596139619 | 0.002 |
| -0.0007114764130643492 | 0.007 |
| -0.00018172991946630024 | -0.001 |
| 0.011007863115068517 | -0.011 |
| 0.002494809663015962 | 0.009 |
| -0.012968731575016657 | -0.008 |
| 0.014642450911824145 | 0.032 |
| 0.010452337732424155 | 0.012 |
| 0.01469942051995421 | 0.036 |
| -0.010354661511665864 | -0.024 |
| -0.006140486597300043 | -0.007 |
| 0.01287252984617182 | -0.012 |
| -0.011080691642651352 | -0.014 |
| -0.008829829085981511 | -0.016 |
| 0.0021952713463186946 | 0.003 |
| 0.011448590134117032 | 0.022 |
| -0.0002803767683676739 | -0.016 |
| 0.0027731236687436045 | 0.007 |
| -0.01378869707782826 | 0.002 |
| -0.0027674487398573477 | -0.01 |
| -0.020041234687148357 | -0.071 |
| -0.0015735464083616035 | 0.003 |
| 0.0053294245875146196 | 0.01 |
| -0.010537544363360851 | -0.009 |
| 0.0030730168965551474 | -0.002 |
| -0.0030359797500902896 | 0.002 |
| -0.004725262269687613 | -0.019 |
| 0.0075821419804169565 | 0.008 |
| 0.0161477890665227 | 0.019 |
| 0.0006871595099910977 | -0.001 |
| -0.015326967063694075 | -0.025 |
| 0.001414821002566402 | 0.003 |
| -0.018459372596762003 | -0.012 |
| -0.014478143694236278 | -0.006 |
| -0.0015097408062482165 | 0.001 |
| 0.016476647924144494 | -0.003 |
| -0.006980856226510457 | 0.008 |
| 0.017561980816715783 | -0.004 |
| -0.01101942286909019 | 0.006 |
| 0.008918358593079878 | 0.003 |
| 0.012982181765728518 | 0.001 |
| -0.01646318766285193 | -0.024 |
| 0.002984528711166279 | 0.005 |
| 0.0056398022650376856 | -0.003 |
| 0.0016469444647304599 | -0.006 |
| -0.0015738410521103363 | -0.002 |
| 0.014237259113583312 | 0.009 |
| 0.0057152646227105475 | 0.007 |
| 0.014436547571732294 | 0.034 |
| 0.0036989178231867648 | 0.009 |
| -0.0057970522559043225 | -0.009 |
| -0.0024923181973370845 | -0.021 |
| 0.003579129567424122 | 0 |
| 0.0009963410653295313 | 0.009 |
| -4.137148920324574e-05 | 0.009 |
| -0.004134886369720592 | -0.011 |
| 0.013262625398648753 | 0.006 |
| -0.0020693547375681964 | 0 |
| 0.0033062325383550473 | 0.011 |
| 0.0008551496873283604 | 0.012 |
| -8.423849602978706e-05 | -0.007 |
| -0.005952552882162232 | 0.006 |
| 0.0009031936248575789 | 0.005 |
| 0.0008515744450250384 | 0.005 |
| -0.015810821263512076 | -0.018 |
| -0.003841213469789828 | -0.028 |
| 0.019566123190639217 | 0.02 |
| 0.008253231286347917 | 0.022 |
| -0.0003861392787588569 | -0.009 |
| -0.011586253889876552 | -0.011 |
| -0.006998286233062534 | -0.004 |
| -0.007218725172645657 | -0.025 |
| 0.018474744042430657 | 0.014 |
| 0.0004521003324267081 | -0.006 |
| -0.004579374208577791 | 0.009 |
| 0.004483913021312569 | -0.005 |
| -0.0016966193288928677 | -0.005 |
| -0.0015832974226629437 | 0.01 |
| 0.002958235533743192 | -0.007 |
| -0.006377711373504735 | -0.022 |
| 0.011890800262780221 | 0.036 |
| 0.009445100354191105 | 0.009 |
| -0.001445909410321633 | -0.015 |
| 0.00015505799168891166 | -0.001 |
| -0.011222073018606449 | 0.015 |
| -0.007318638164020563 | -0.013 |
| 0.00875769092446621 | -0.015 |
| 0.013048987300302572 | 0.021 |
| 1.6645067709930572e-05 | -0.001 |
| -0.006108638170785219 | -0.031 |
| 0.009854467765435526 | 0.017 |
| 0.014534401637518846 | 0.026 |
| -0.002003563447343426 | -0.01 |
| 0.002353882619408054 | 0.01 |
| -0.0038119915496573897 | 0.019 |
| 0.006188606028794119 | -0.002 |
| 0.0011481323635922358 | -0.012 |
| 0.009321075820101221 | 0.012 |
| 0.006932584761680793 | -0.003 |
| 0.0008194076003487094 | -0.001 |
| 0.012178136985173449 | 0.008 |
| -0.0036716193988033385 | -0.005 |
| -0.0047351341054383544 | 0.003 |
| -0.005245277085977551 | -0.002 |
| 0.003710753626574581 | 0.002 |
| -0.007658795633847637 | -0.001 |
| -0.004486779982200151 | 0.024 |
| 0.011455777787018118 | 0.019 |
| -0.00035400978894173374 | -0.023 |
| 0.004473526683512752 | 0.004 |
| 0.012269017659743087 | 0.009 |
| 0.0011706865481149187 | -0.002 |
| -0.0019683139606652134 | 0.003 |
| -0.007922515415510367 | -0.028 |
| -0.0028651801277997935 | 0.003 |
| 0.0024051194034939716 | 0.025 |
| 0.006742215156717579 | 0.011 |
| 0.007411145100759908 | 0.012 |
| 0.00847017995778332 | -0.009 |
| -0.001024381158481913 | 0.006 |
| 0.003855356437357571 | -0.001 |
| 0.007117288222535212 | 0.002 |
| 0.0023578588709500803 | 0.009 |
| -0.006756875147840957 | -0.001 |
| 0.00032415482692993436 | 0.004 |
| 0.004034089155574794 | 0.014 |
| 0.002814712029929778 | 0 |
| -0.00015544744781559316 | 0.014 |
| -0.006424700279192064 | 0 |
| 0.009877881875342887 | 0.005 |
| 0.0014687171966489831 | 0.007 |
| -0.0026650918726683903 | -0.005 |
| -0.01383957541738301 | -0.011 |
| -0.002547973917609636 | 0.004 |
| -0.00529999622380839 | -0.01 |
| 0.00902405745383561 | 0.008 |
| -0.004218270022397053 | -0.004 |
| -0.007038747560775049 | 0.001 |
| 0.00025068771249703303 | 0.004 |
| -0.0010696312010077813 | 0.005 |
| 0.005750383620255262 | -0.004 |
| -0.011550831677699436 | 0.007 |
| -0.0075554433893813 | 0.003 |
| -0.007712864385729601 | -0.017 |
| -0.00014872916647590273 | 0 |
| 0.006879175048229769 | -0.01 |
| -0.0027774179104816943 | 0.001 |
| 0.011044888377340412 | 0.005 |
| -0.013458039995401183 | -0.011 |
| 0.006717988442317857 | 0.001 |
| 0.0062645975336552695 | 0.009 |
| 0.014508347036412905 | 0.011 |
| 0.0038331298928546698 | 0.004 |
| -0.0015969452055097921 | -0.001 |
| 0.0017991596526802933 | 0.008 |
| -0.00419419058100845 | -0.016 |
| -0.0069715777558858605 | -0.005 |
| -0.0032113009127796577 | 0.007 |
| 0.0014266008258556617 | 0.001 |
| 0.006723514803174124 | -0.001 |
| -0.005695872498027943 | -0.006 |
| 0.001241623523611013 | -0.001 |
| 0.008429883781315706 | 0.012 |
| -0.012159552507158722 | -0.025 |
| 0.0007212964460983073 | -0.013 |
| -0.0021511026084926055 | -0.008 |
| -0.009394795170962755 | -0.012 |
| -0.016400890463858953 | -0.013 |
| -0.0022956120092377796 | -0.003 |
| 0.00402309227186648 | 0.002 |
| -0.01473449776826885 | -0.013 |
| 0.0002293186195019281 | -0.002 |
| 0.005893073124170867 | 0.006 |
| -0.002709491359862204 | -0.004 |
| 7.92901202177898e-05 | -0.008 |
| -0.01374408577578079 | -0.026 |
| 0.008109801510834735 | 0.002 |
| -0.0013040164174730196 | -0.002 |
| 0.011814879091820885 | 0.004 |
| 0.006303818034118613 | 0.009 |
| 0.005207972949908379 | 0.013 |
| 0.004293017364807916 | -0.004 |
| -0.006246358765807258 | -0.017 |
| -0.005018840769632216 | -0.004 |
| 0.010594346293018697 | 0.019 |
| -9.831650139591197e-05 | -0.005 |
| -0.013399798774352711 | -0.019 |
| -0.00848282575441528 | -0.012 |
| -0.012585320243104325 | -0.001 |
| -0.001685542214310054 | -0.005 |
| 0.00726575986948208 | -0.006 |
| -0.014339592436341642 | -0.008 |
| -0.01183251050332379 | -0.01 |
| -0.004800313253070176 | -0.006 |
| 0.012010093822027113 | 0.018 |
| 0.006474961721408823 | 0.011 |
| 0.010505985025513809 | 0.007 |
| 0.018858574846738696 | 0.028 |
| 0.009393716215277292 | 0.004 |
| 0.0017529609897344312 | -0.004 |
| 0.0028401412741241305 | 0.001 |
| 0.0010049378994057 | 0.004 |
| -0.008083910212239531 | -0.027 |
| 0.01561640999689451 | 0.013 |
| -0.0008357416584374722 | -0.012 |
| 0.01907492831317792 | 0.054 |